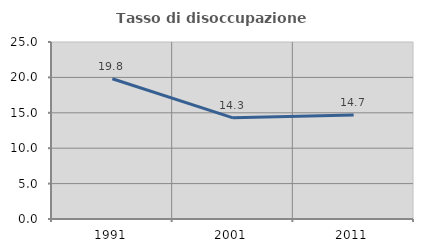
| Category | Tasso di disoccupazione giovanile  |
|---|---|
| 1991.0 | 19.811 |
| 2001.0 | 14.286 |
| 2011.0 | 14.706 |